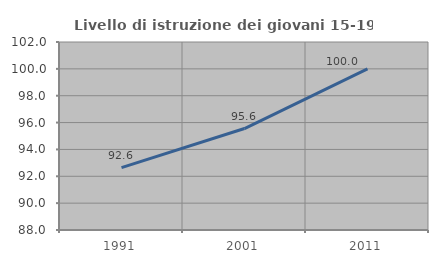
| Category | Livello di istruzione dei giovani 15-19 anni |
|---|---|
| 1991.0 | 92.647 |
| 2001.0 | 95.556 |
| 2011.0 | 100 |